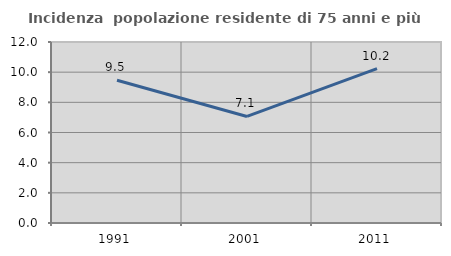
| Category | Incidenza  popolazione residente di 75 anni e più |
|---|---|
| 1991.0 | 9.467 |
| 2001.0 | 7.065 |
| 2011.0 | 10.238 |